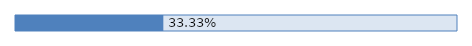
| Category | Series 0 |
|---|---|
| 0 | 0.333 |